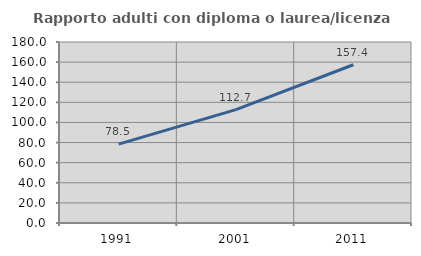
| Category | Rapporto adulti con diploma o laurea/licenza media  |
|---|---|
| 1991.0 | 78.498 |
| 2001.0 | 112.72 |
| 2011.0 | 157.396 |